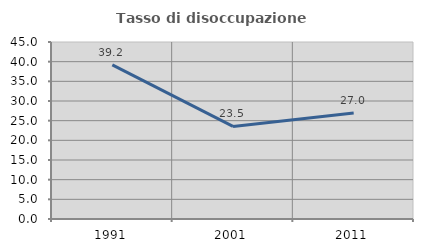
| Category | Tasso di disoccupazione giovanile  |
|---|---|
| 1991.0 | 39.173 |
| 2001.0 | 23.529 |
| 2011.0 | 26.955 |